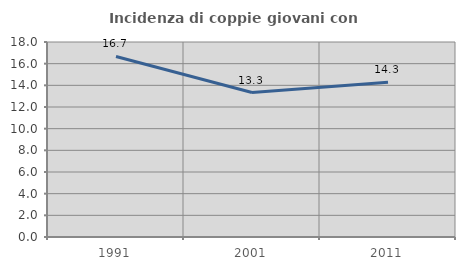
| Category | Incidenza di coppie giovani con figli |
|---|---|
| 1991.0 | 16.667 |
| 2001.0 | 13.333 |
| 2011.0 | 14.286 |